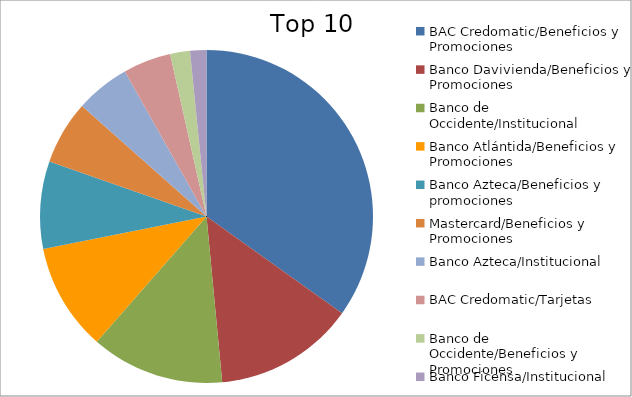
| Category | Series 0 |
|---|---|
| BAC Credomatic/Beneficios y Promociones | 33.42 |
| Banco Davivienda/Beneficios y Promociones | 13.07 |
| Banco de Occidente/Institucional | 12.42 |
| Banco Atlántida/Beneficios y Promociones | 9.99 |
| Banco Azteca/Beneficios y promociones | 8.15 |
| Mastercard/Beneficios y Promociones | 5.93 |
| Banco Azteca/Institucional | 5.07 |
| BAC Credomatic/Tarjetas | 4.46 |
| Banco de Occidente/Beneficios y Promociones | 1.84 |
| Banco Ficensa/Institucional | 1.52 |